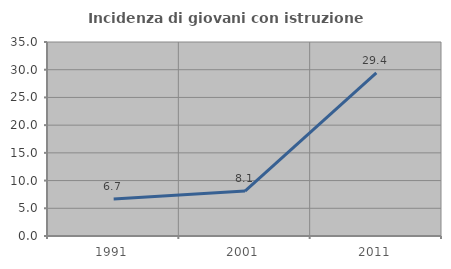
| Category | Incidenza di giovani con istruzione universitaria |
|---|---|
| 1991.0 | 6.667 |
| 2001.0 | 8.108 |
| 2011.0 | 29.412 |